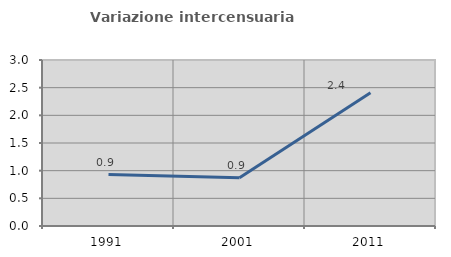
| Category | Variazione intercensuaria annua |
|---|---|
| 1991.0 | 0.93 |
| 2001.0 | 0.872 |
| 2011.0 | 2.408 |